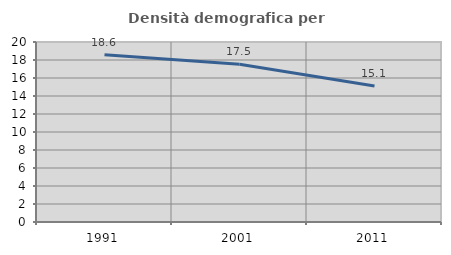
| Category | Densità demografica |
|---|---|
| 1991.0 | 18.592 |
| 2001.0 | 17.523 |
| 2011.0 | 15.114 |